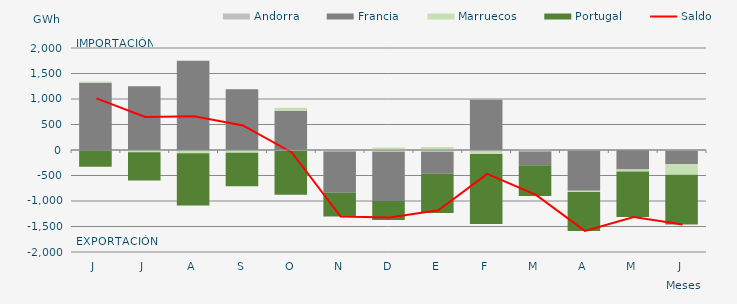
| Category | Andorra | Francia | Marruecos | Portugal |
|---|---|---|---|---|
| J | -5.126 | 1319.462 | 23.039 | -324.448 |
| J | -3.551 | 1247.95 | -38.635 | -558.283 |
| A | -19.02 | 1750.608 | -45.265 | -1025.301 |
| S | -11.131 | 1193.426 | -45.19 | -654.794 |
| O | -15.195 | 769.066 | 59.008 | -860.78 |
| N | -28.632 | -809.352 | -1.998 | -465.164 |
| D | -40.654 | -959.109 | 48.514 | -372.253 |
| E | -38.484 | -427.138 | 57.119 | -771.475 |
| F | -34.803 | 984.059 | -44.168 | -1373 |
| M | -31.125 | -269.835 | 22.023 | -601.362 |
| A | -16.536 | -782.902 | -22.588 | -764.73 |
| M | -5.354 | -378.945 | -37.987 | -891.537 |
| J | -16.539 | -262.937 | -205.078 | -974.176 |